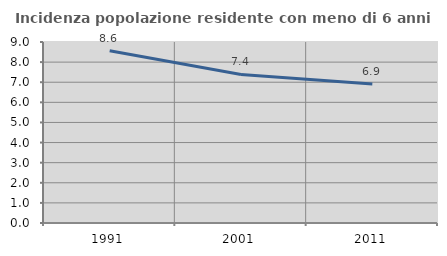
| Category | Incidenza popolazione residente con meno di 6 anni |
|---|---|
| 1991.0 | 8.566 |
| 2001.0 | 7.386 |
| 2011.0 | 6.907 |